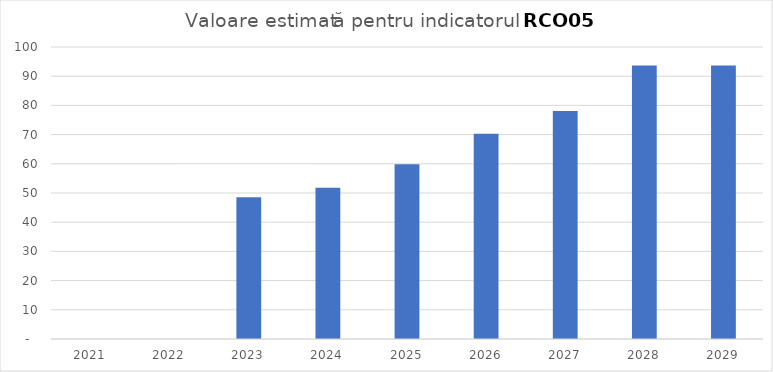
| Category | Series 0 |
|---|---|
| 2021.0 | 0 |
| 2022.0 | 0 |
| 2023.0 | 48.513 |
| 2024.0 | 51.835 |
| 2025.0 | 59.81 |
| 2026.0 | 70.277 |
| 2027.0 | 78.085 |
| 2028.0 | 93.702 |
| 2029.0 | 93.702 |